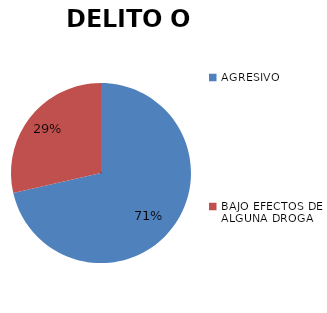
| Category | DELITO O FALTA |
|---|---|
| AGRESIVO | 5 |
| BAJO EFECTOS DE ALGUNA DROGA | 2 |